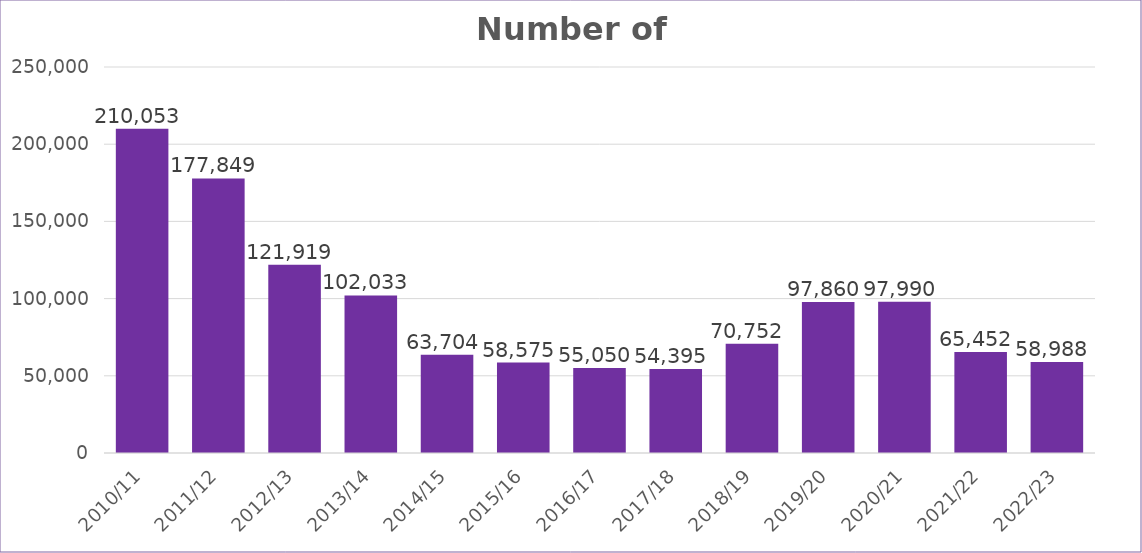
| Category | Series 0 |
|---|---|
| 2010/11 | 210053 |
| 2011/12 | 177849 |
| 2012/13 | 121919 |
| 2013/14 | 102033 |
| 2014/15 | 63704 |
| 2015/16 | 58575 |
| 2016/17 | 55050 |
| 2017/18 | 54395 |
| 2018/19 | 70752 |
| 2019/20 | 97860 |
| 2020/21 | 97990 |
| 2021/22 | 65452 |
| 2022/23 | 58988 |